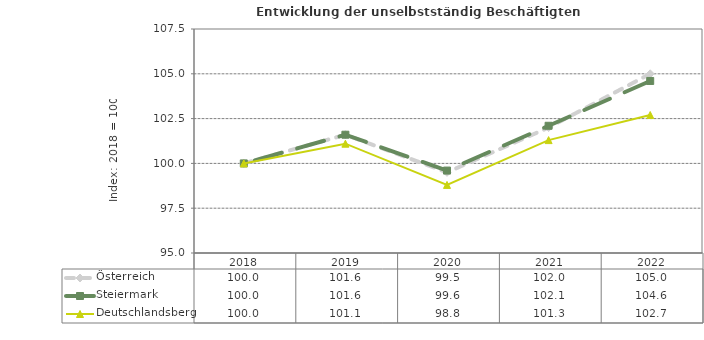
| Category | Österreich | Steiermark | Deutschlandsberg |
|---|---|---|---|
| 2022.0 | 105 | 104.6 | 102.7 |
| 2021.0 | 102 | 102.1 | 101.3 |
| 2020.0 | 99.5 | 99.6 | 98.8 |
| 2019.0 | 101.6 | 101.6 | 101.1 |
| 2018.0 | 100 | 100 | 100 |